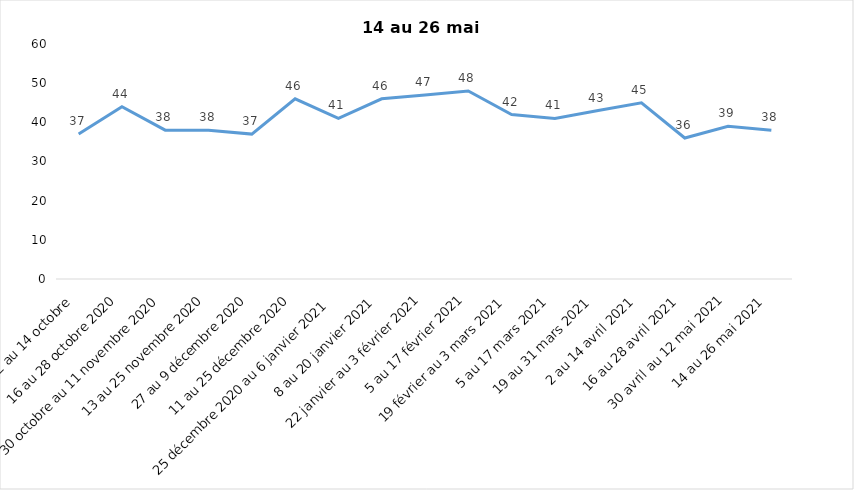
| Category | Toujours aux trois mesures |
|---|---|
| 2 au 14 octobre  | 37 |
| 16 au 28 octobre 2020 | 44 |
| 30 octobre au 11 novembre 2020 | 38 |
| 13 au 25 novembre 2020 | 38 |
| 27 au 9 décembre 2020 | 37 |
| 11 au 25 décembre 2020 | 46 |
| 25 décembre 2020 au 6 janvier 2021 | 41 |
| 8 au 20 janvier 2021 | 46 |
| 22 janvier au 3 février 2021 | 47 |
| 5 au 17 février 2021 | 48 |
| 19 février au 3 mars 2021 | 42 |
| 5 au 17 mars 2021 | 41 |
| 19 au 31 mars 2021 | 43 |
| 2 au 14 avril 2021 | 45 |
| 16 au 28 avril 2021 | 36 |
| 30 avril au 12 mai 2021 | 39 |
| 14 au 26 mai 2021 | 38 |